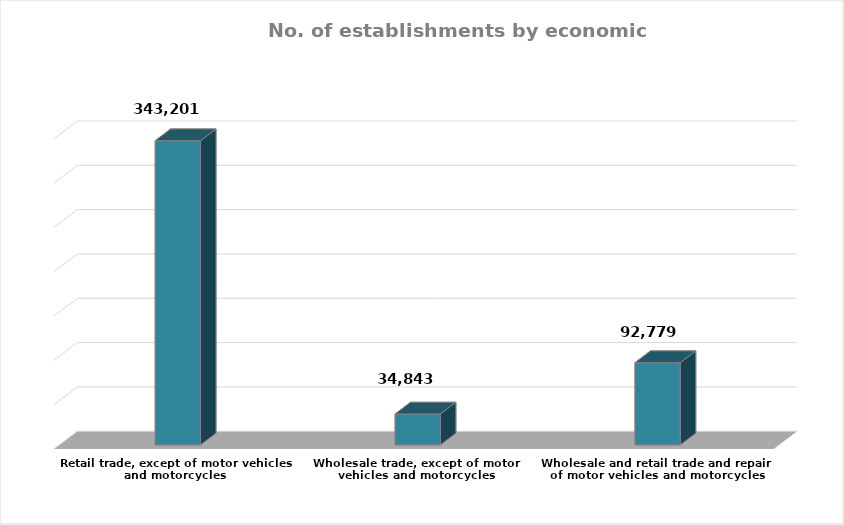
| Category | عدد المنشآت |
|---|---|
| Wholesale and retail trade and repair of motor vehicles and motorcycles | 92779 |
| Wholesale trade, except of motor vehicles and motorcycles | 34843 |
| Retail trade, except of motor vehicles and motorcycles | 343201 |